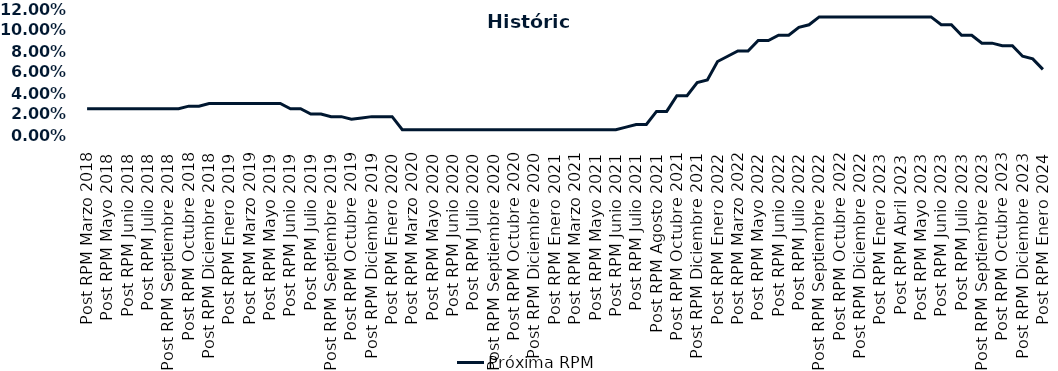
| Category | Próxima RPM |
|---|---|
| Post RPM Marzo 2018 | 0.025 |
| Pre RPM Mayo 2018 | 0.025 |
| Post RPM Mayo 2018 | 0.025 |
| Pre RPM Junio 2018 | 0.025 |
| Post RPM Junio 2018 | 0.025 |
| Pre RPM Julio 2018 | 0.025 |
| Post RPM Julio 2018 | 0.025 |
| Pre RPM Septiembre 2018 | 0.025 |
| Post RPM Septiembre 2018 | 0.025 |
| Pre RPM Octubre 2018 | 0.025 |
| Post RPM Octubre 2018 | 0.028 |
| Pre RPM Diciembre 2018 | 0.028 |
| Post RPM Diciembre 2018 | 0.03 |
| Pre RPM Enero 2019 | 0.03 |
| Post RPM Enero 2019 | 0.03 |
| Pre RPM Marzo 2019 | 0.03 |
| Post RPM Marzo 2019 | 0.03 |
| Pre RPM Mayo 2019 | 0.03 |
| Post RPM Mayo 2019 | 0.03 |
| Pre RPM Junio 2019 | 0.03 |
| Post RPM Junio 2019 | 0.025 |
| Pre RPM Julio 2019 | 0.025 |
| Post RPM Julio 2019 | 0.02 |
| Pre RPM Septiembre 2019 | 0.02 |
| Post RPM Septiembre 2019 | 0.018 |
| Pre RPM Octubre 2019 | 0.018 |
| Post RPM Octubre 2019 | 0.015 |
| Pre RPM Diciembre 2019 | 0.016 |
| Post RPM Diciembre 2019 | 0.018 |
| Pre RPM Enero 2020 | 0.018 |
| Post RPM Enero 2020 | 0.018 |
| Pre RPM Marzo 2020 | 0.005 |
| Post RPM Marzo 2020 | 0.005 |
| Pre RPM Mayo 2020 | 0.005 |
| Post RPM Mayo 2020 | 0.005 |
| Pre RPM Junio 2020 | 0.005 |
| Post RPM Junio 2020 | 0.005 |
| Pre RPM Julio 2020 | 0.005 |
| Post RPM Julio 2020 | 0.005 |
| Pre RPM Septiembre 2020 | 0.005 |
| Post RPM Septiembre 2020 | 0.005 |
| Pre RPM Octubre 2020 | 0.005 |
| Post RPM Octubre 2020 | 0.005 |
| Pre RPM Diciembre 2020 | 0.005 |
| Post RPM Diciembre 2020 | 0.005 |
| Pre RPM Enero 2021 | 0.005 |
| Post RPM Enero 2021 | 0.005 |
| Pre RPM Marzo 2021 | 0.005 |
| Post RPM Marzo 2021 | 0.005 |
| Pre RPM Mayo 2021 | 0.005 |
| Post RPM Mayo 2021 | 0.005 |
| Pre RPM Junio 2021 | 0.005 |
| Post RPM Junio 2021 | 0.005 |
| Pre RPM Julio 2021 | 0.008 |
| Post RPM Julio 2021 | 0.01 |
| Pre RPM Agosto 2021 | 0.01 |
| Post RPM Agosto 2021 | 0.022 |
| Pre RPM Octubre 2021 | 0.022 |
| Post RPM Octubre 2021 | 0.038 |
| Pre RPM Diciembre 2021 | 0.038 |
| Post RPM Diciembre 2021 | 0.05 |
| Pre RPM Enero 2022 | 0.052 |
| Post RPM Enero 2022 | 0.07 |
| Pre RPM Marzo 2022 | 0.075 |
| Post RPM Marzo 2022 | 0.08 |
| Pre RPM Mayo 2022 | 0.08 |
| Post RPM Mayo 2022 | 0.09 |
| Pre RPM Junio 2022 | 0.09 |
| Post RPM Junio 2022 | 0.095 |
| Pre RPM Julio 2022 | 0.095 |
| Post RPM Julio 2022 | 0.102 |
| Pre RPM Septiembre 2022 | 0.105 |
| Post RPM Septiembre 2022 | 0.112 |
| Pre RPM Octubre 2022 | 0.112 |
| Post RPM Octubre 2022 | 0.112 |
| Pre RPM Diciembre 2022 | 0.112 |
| Post RPM Diciembre 2022 | 0.112 |
| Pre RPM Enero 2023 | 0.112 |
| Post RPM Enero 2023 | 0.112 |
| Pre RPM Abril 2023 | 0.112 |
| Post RPM Abril 2023 | 0.112 |
| Pre RPM Mayo 2023 | 0.112 |
| Post RPM Mayo 2023 | 0.112 |
| Pre RPM Junio 2023 | 0.112 |
| Post RPM Junio 2023 | 0.105 |
| Pre RPM Julio 2023 | 0.105 |
| Post RPM Julio 2023 | 0.095 |
| Pre RPM Septiembre 2023 | 0.095 |
| Post RPM Septiembre 2023 | 0.088 |
| Pre RPM Octubre 2023 | 0.088 |
| Post RPM Octubre 2023 | 0.085 |
| Pre RPM Diciembre 2023 | 0.085 |
| Post RPM Diciembre 2023 | 0.075 |
| Pre RPM Enero 2024 | 0.072 |
| Post RPM Enero 2024 | 0.062 |